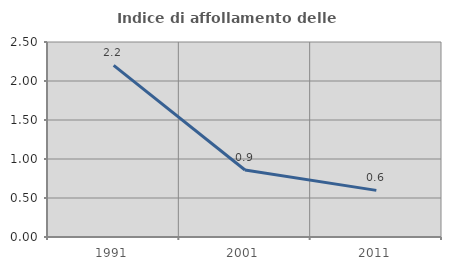
| Category | Indice di affollamento delle abitazioni  |
|---|---|
| 1991.0 | 2.2 |
| 2001.0 | 0.858 |
| 2011.0 | 0.598 |